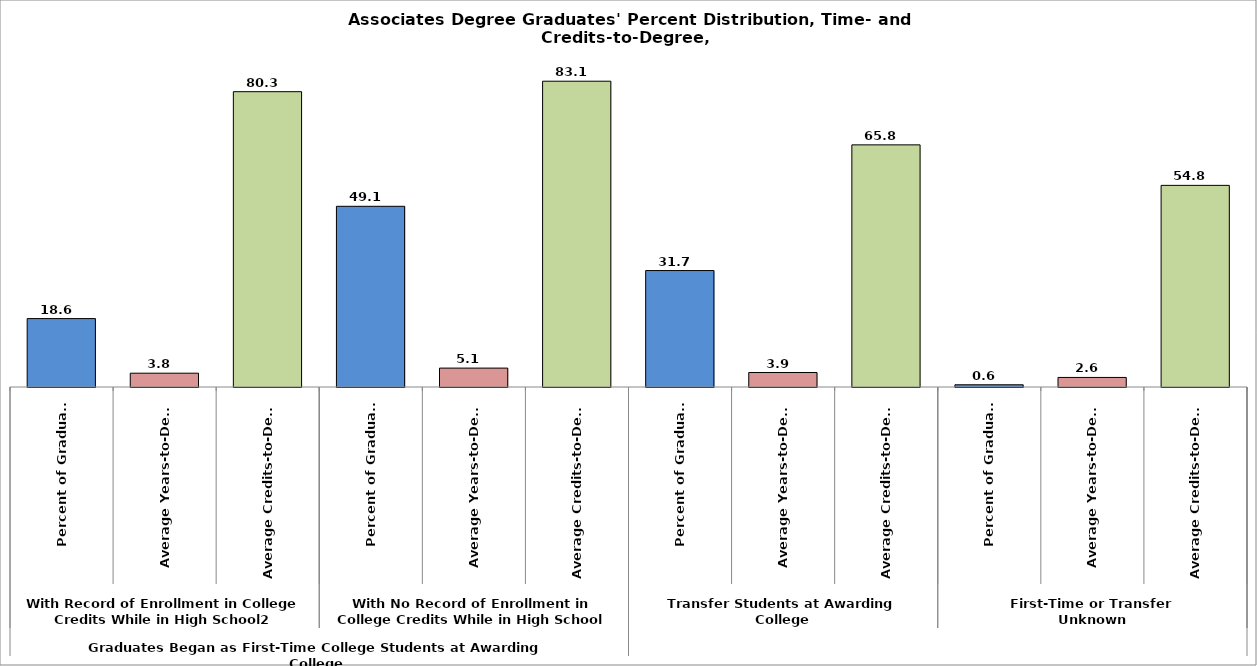
| Category | Series 10 |
|---|---|
| 0 | 18.604 |
| 1 | 3.755 |
| 2 | 80.3 |
| 3 | 49.132 |
| 4 | 5.14 |
| 5 | 83.146 |
| 6 | 31.662 |
| 7 | 3.941 |
| 8 | 65.838 |
| 9 | 0.602 |
| 10 | 2.6 |
| 11 | 54.826 |